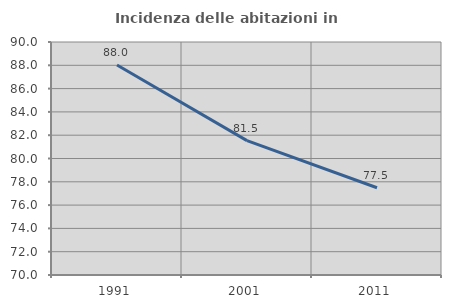
| Category | Incidenza delle abitazioni in proprietà  |
|---|---|
| 1991.0 | 88.019 |
| 2001.0 | 81.534 |
| 2011.0 | 77.489 |